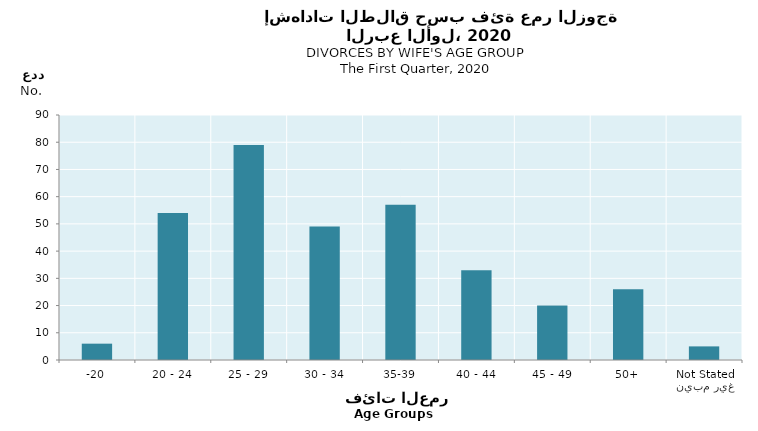
| Category | Series 0 |
|---|---|
| -20 | 6 |
| 20 - 24 | 54 |
| 25 - 29 | 79 |
| 30 - 34 | 49 |
| 35-39 | 57 |
| 40 - 44 | 33 |
| 45 - 49 | 20 |
| 50+ | 26 |
| غير مبين
Not Stated | 5 |